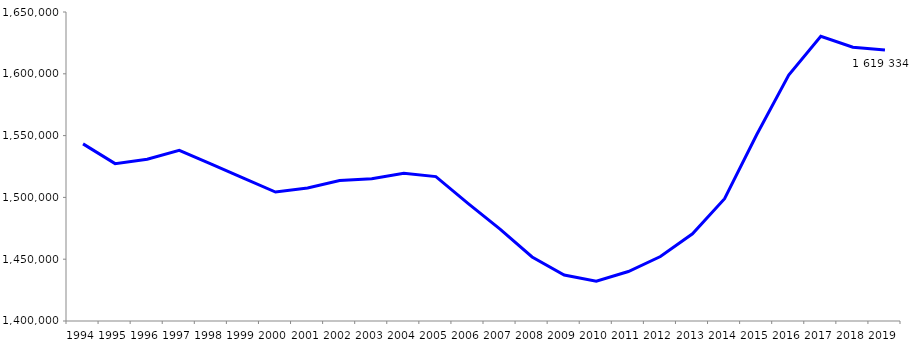
| Category | 1994 1995 1996 1997 1998 1999 2000 2001 2002 2003 2004 2005 2006 2007 2008 2009 2010 2011 2012 2013 2014 2015 2016 2017 2018 2019 |
|---|---|
| 1994 | 1543322 |
| 1995 | 1527334 |
| 1996 | 1530893 |
| 1997 | 1538134 |
| 1998 | 1526911 |
| 1999 | 1515517 |
| 2000 | 1504359 |
| 2001 | 1507627 |
| 2002 | 1513602 |
| 2003 | 1515103 |
| 2004 | 1519460 |
| 2005 | 1516827 |
| 2006 | 1495220 |
| 2007 | 1474385 |
| 2008 | 1451806 |
| 2009 | 1437164 |
| 2010 | 1432195 |
| 2011 | 1440007 |
| 2012 | 1452155 |
| 2013 | 1470561 |
| 2014 | 1498897 |
| 2015 | 1550647 |
| 2016 | 1598985 |
| 2017 | 1630285 |
| 2018 | 1621551 |
| 2019 | 1619334 |